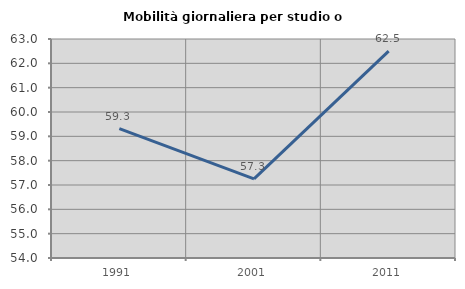
| Category | Mobilità giornaliera per studio o lavoro |
|---|---|
| 1991.0 | 59.316 |
| 2001.0 | 57.255 |
| 2011.0 | 62.5 |